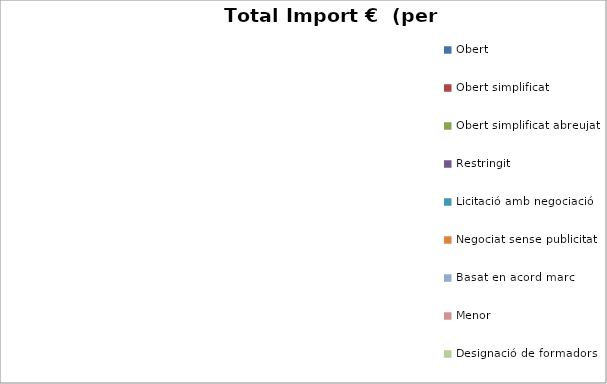
| Category | Total preu              (amb iva) |
|---|---|
| Obert | 0 |
| Obert simplificat | 0 |
| Obert simplificat abreujat | 0 |
| Restringit | 0 |
| Licitació amb negociació | 0 |
| Negociat sense publicitat | 0 |
| Basat en acord marc | 0 |
| Menor | 0 |
| Designació de formadors | 0 |